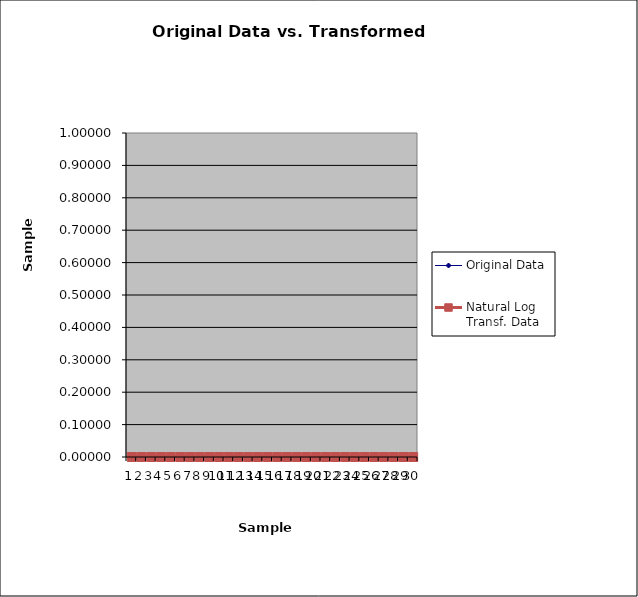
| Category | Original Data | Natural Log Transf. Data |
|---|---|---|
| 0 |  | 0 |
| 1 |  | 0 |
| 2 |  | 0 |
| 3 |  | 0 |
| 4 |  | 0 |
| 5 |  | 0 |
| 6 |  | 0 |
| 7 |  | 0 |
| 8 |  | 0 |
| 9 |  | 0 |
| 10 |  | 0 |
| 11 |  | 0 |
| 12 |  | 0 |
| 13 |  | 0 |
| 14 |  | 0 |
| 15 |  | 0 |
| 16 |  | 0 |
| 17 |  | 0 |
| 18 |  | 0 |
| 19 |  | 0 |
| 20 |  | 0 |
| 21 |  | 0 |
| 22 |  | 0 |
| 23 |  | 0 |
| 24 |  | 0 |
| 25 |  | 0 |
| 26 |  | 0 |
| 27 |  | 0 |
| 28 |  | 0 |
| 29 |  | 0 |